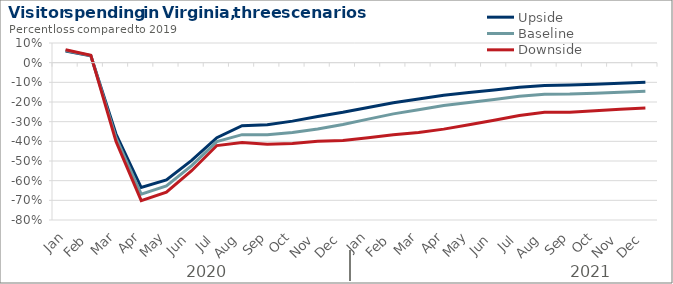
| Category | Upside | Baseline | Downside |
|---|---|---|---|
| Jan | 0.059 | 0.062 | 0.065 |
| Feb | 0.035 | 0.036 | 0.038 |
| Mar | -0.363 | -0.382 | -0.401 |
| Apr | -0.635 | -0.668 | -0.702 |
| May | -0.596 | -0.627 | -0.658 |
| Jun | -0.497 | -0.523 | -0.55 |
| Jul | -0.381 | -0.401 | -0.421 |
| Aug | -0.321 | -0.366 | -0.406 |
| Sep | -0.316 | -0.367 | -0.414 |
| Oct | -0.297 | -0.355 | -0.411 |
| Nov | -0.274 | -0.337 | -0.399 |
| Dec | -0.252 | -0.314 | -0.396 |
| Jan | -0.228 | -0.287 | -0.382 |
| Feb | -0.204 | -0.26 | -0.367 |
| Mar | -0.185 | -0.24 | -0.355 |
| Apr | -0.166 | -0.218 | -0.338 |
| May | -0.152 | -0.203 | -0.316 |
| Jun | -0.139 | -0.187 | -0.293 |
| Jul | -0.125 | -0.171 | -0.268 |
| Aug | -0.116 | -0.16 | -0.252 |
| Sep | -0.114 | -0.16 | -0.252 |
| Oct | -0.109 | -0.155 | -0.245 |
| Nov | -0.104 | -0.15 | -0.237 |
| Dec | -0.1 | -0.145 | -0.23 |